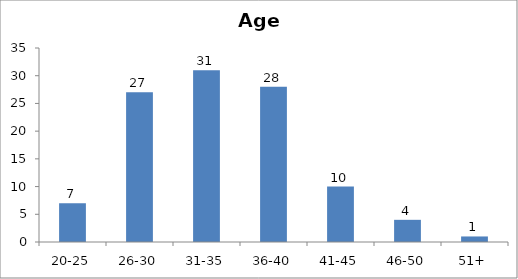
| Category | Age |
|---|---|
| 20-25 | 7 |
| 26-30 | 27 |
| 31-35 | 31 |
| 36-40 | 28 |
| 41-45 | 10 |
| 46-50 | 4 |
| 51+ | 1 |